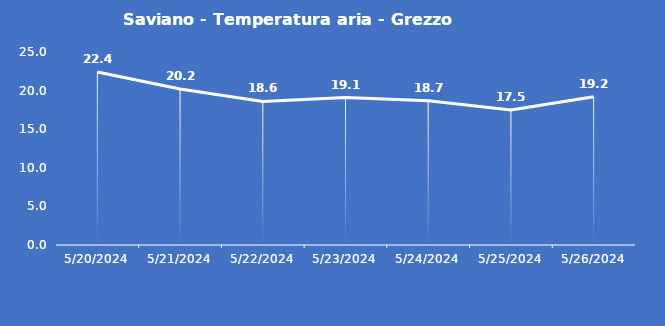
| Category | Saviano - Temperatura aria - Grezzo (°C) |
|---|---|
| 5/20/24 | 22.4 |
| 5/21/24 | 20.2 |
| 5/22/24 | 18.6 |
| 5/23/24 | 19.1 |
| 5/24/24 | 18.7 |
| 5/25/24 | 17.5 |
| 5/26/24 | 19.2 |